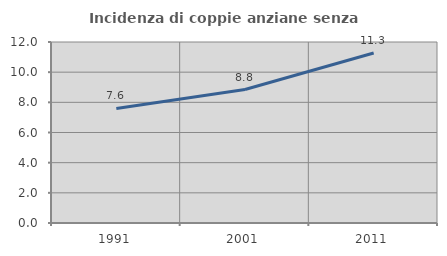
| Category | Incidenza di coppie anziane senza figli  |
|---|---|
| 1991.0 | 7.598 |
| 2001.0 | 8.847 |
| 2011.0 | 11.267 |